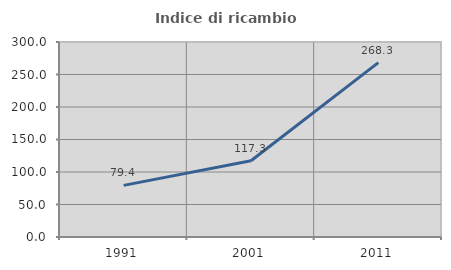
| Category | Indice di ricambio occupazionale  |
|---|---|
| 1991.0 | 79.389 |
| 2001.0 | 117.273 |
| 2011.0 | 268.254 |